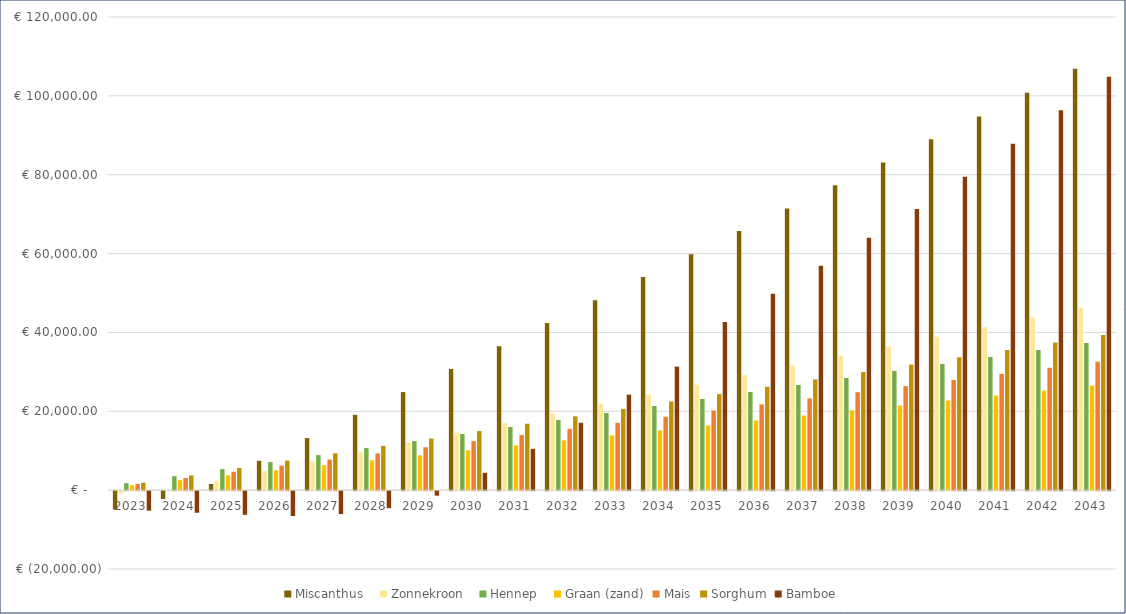
| Category | Miscanthus   | Zonnekroon   | Hennep   | Graan (zand) | Mais | Sorghum | Bamboe |
|---|---|---|---|---|---|---|---|
| 2023.0 | -4676.4 | -506.4 | 1778.17 | 1263.1 | 1552 | 1872.2 | -4951 |
| 2024.0 | -2007.61 | -7.95 | 3556.34 | 2526.2 | 3104 | 3744.4 | -5477 |
| 2025.0 | 1566.96 | 2400.8 | 5334.51 | 3789.3 | 4656 | 5616.6 | -6003 |
| 2026.0 | 7447.99 | 4834.05 | 7112.68 | 5052.4 | 6208 | 7488.8 | -6301.336 |
| 2027.0 | 13216.02 | 7267.3 | 8890.85 | 6315.5 | 7760 | 9361 | -5816.856 |
| 2028.0 | 19097.05 | 9700.55 | 10669.02 | 7578.6 | 9312 | 11233.2 | -4321.895 |
| 2029.0 | 24865.08 | 12133.8 | 12447.19 | 8841.7 | 10864 | 13105.4 | -1154.24 |
| 2030.0 | 30746.11 | 14567.05 | 14225.36 | 10104.8 | 12416 | 14977.6 | 4390.824 |
| 2031.0 | 36514.14 | 17000.3 | 16003.53 | 11367.9 | 13968 | 16849.8 | 10471.195 |
| 2032.0 | 42395.17 | 19433.55 | 17781.7 | 12631 | 15520 | 18722 | 17086.872 |
| 2033.0 | 48163.2 | 21866.8 | 19559.87 | 13894.1 | 17072 | 20594.2 | 24211.197 |
| 2034.0 | 54044.23 | 24300.05 | 21338.04 | 15157.2 | 18624 | 22466.4 | 31335.522 |
| 2035.0 | 59812.26 | 26733.3 | 23116.21 | 16420.3 | 20176 | 24338.6 | 42659.846 |
| 2036.0 | 65693.29 | 29166.55 | 24894.38 | 17683.4 | 21728 | 26210.8 | 49784.171 |
| 2037.0 | 71461.32 | 31599.8 | 26672.55 | 18946.5 | 23280 | 28083 | 56908.496 |
| 2038.0 | 77342.35 | 34033.05 | 28450.72 | 20209.6 | 24832 | 29955.2 | 64032.82 |
| 2039.0 | 83110.38 | 36466.3 | 30228.89 | 21472.7 | 26384 | 31827.4 | 71308.921 |
| 2040.0 | 88991.41 | 38899.55 | 32007.06 | 22735.8 | 27936 | 33699.6 | 79495.678 |
| 2041.0 | 94759.44 | 41332.8 | 33785.23 | 23998.9 | 29488 | 35571.8 | 87834.211 |
| 2042.0 | 100805.47 | 43766.05 | 35563.4 | 25262 | 31040 | 37444 | 96324.519 |
| 2043.0 | 106851.5 | 46199.3 | 37341.57 | 26525.1 | 32592 | 39316.2 | 104814.828 |